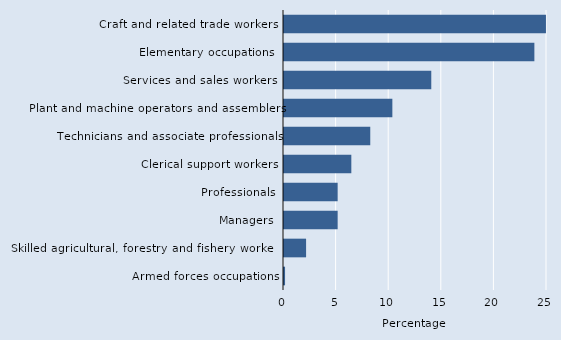
| Category | Series 0 |
|---|---|
| Craft and related trade workers  | 24.9 |
| Elementary occupations  | 23.8 |
| Services and sales workers  | 14 |
| Plant and machine operators and assemblers | 10.3 |
| Technicians and associate professionals | 8.2 |
| Clerical support workers | 6.4 |
| Professionals | 5.1 |
| Managers | 5.1 |
| Skilled agricultural, forestry and fishery workers  | 2.1 |
| Armed forces occupations | 0.1 |